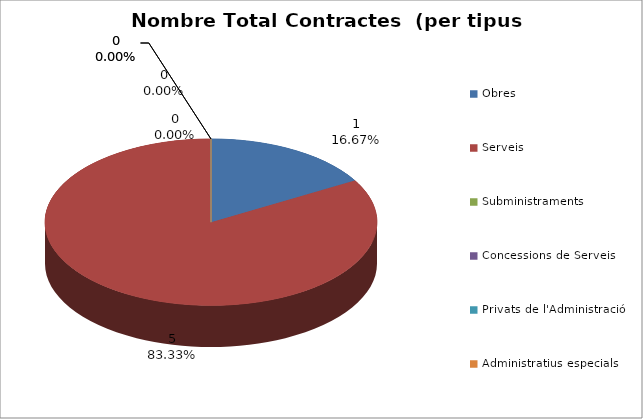
| Category | Nombre Total Contractes |
|---|---|
| Obres | 1 |
| Serveis | 5 |
| Subministraments | 0 |
| Concessions de Serveis | 0 |
| Privats de l'Administració | 0 |
| Administratius especials | 0 |